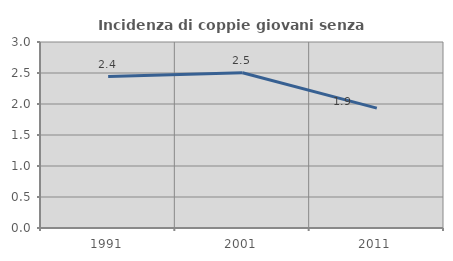
| Category | Incidenza di coppie giovani senza figli |
|---|---|
| 1991.0 | 2.443 |
| 2001.0 | 2.504 |
| 2011.0 | 1.934 |